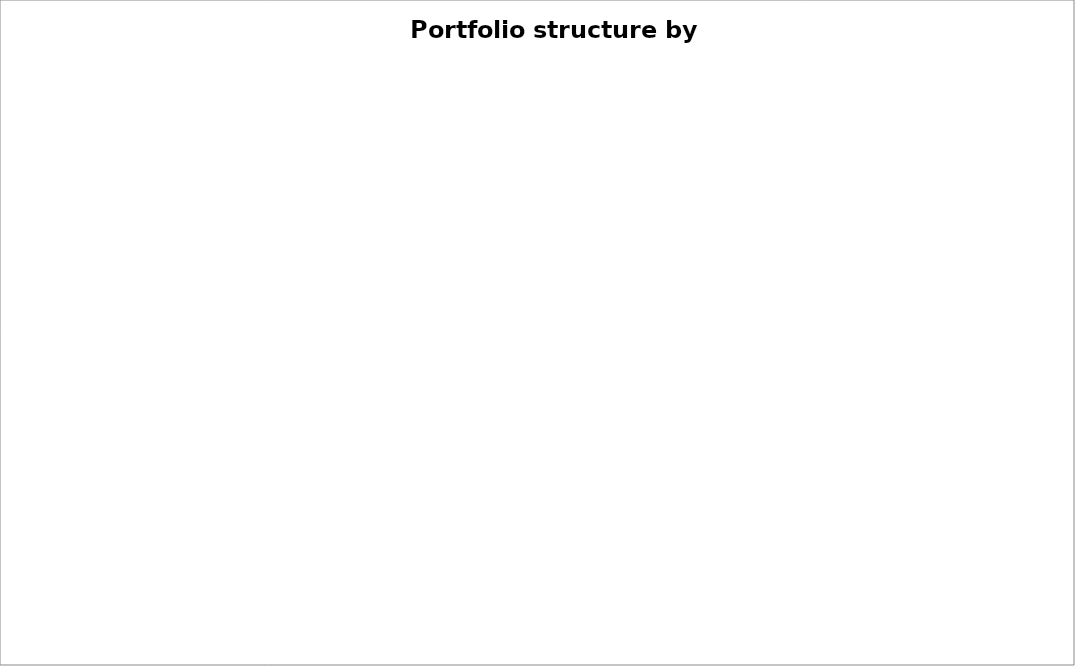
| Category | Value in USD |
|---|---|
| Bonds | 0 |
| Stocks | 0 |
| ETF | 0 |